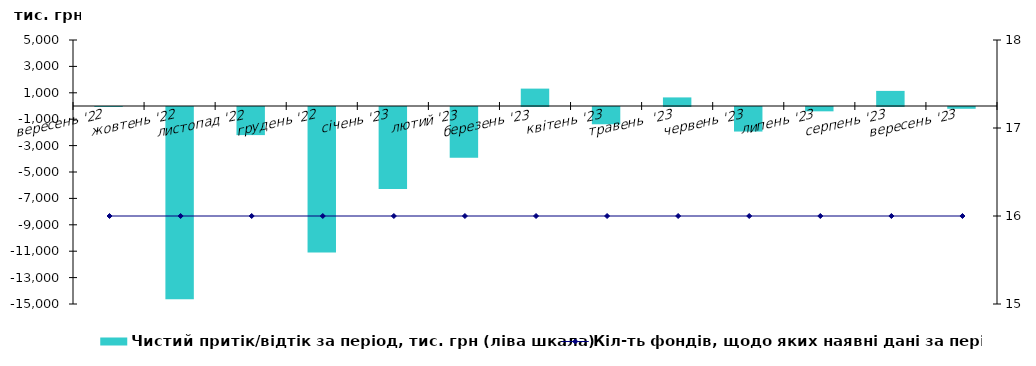
| Category | Чистий притік/відтік за період, тис. грн (ліва шкала) |
|---|---|
| вересень '22 | -2.047 |
| жовтень '22 | -14565.502 |
| листопад '22 | -2128.834 |
| грудень '22 | -11022.039 |
| січень '23 | -6205.312 |
| лютий '23 | -3853.023 |
| березень '23 | 1317.001 |
| квітень '23 | -1308.231 |
| травень  '23 | 650.849 |
| червень '23 | -1859.948 |
| липень '23 | -327.723 |
| серпень '23 | 1144.35 |
| вересень '23 | -134.311 |